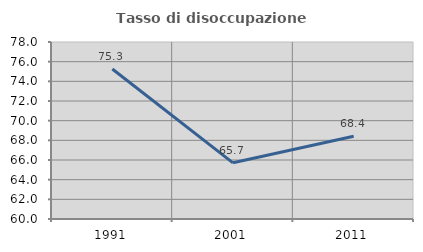
| Category | Tasso di disoccupazione giovanile  |
|---|---|
| 1991.0 | 75.258 |
| 2001.0 | 65.714 |
| 2011.0 | 68.421 |